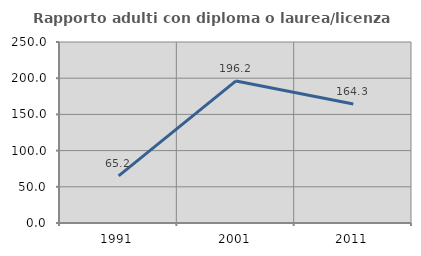
| Category | Rapporto adulti con diploma o laurea/licenza media  |
|---|---|
| 1991.0 | 65.19 |
| 2001.0 | 196.241 |
| 2011.0 | 164.286 |